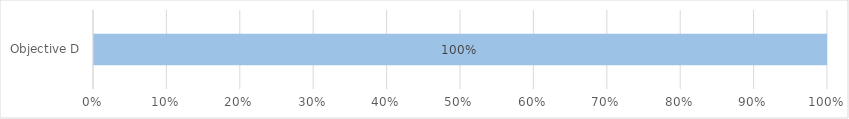
| Category | Not yet assessed | Not achieved | Partially Achieved | Achieved |
|---|---|---|---|---|
| Objective D | 1 | 0 | 0 | 0 |